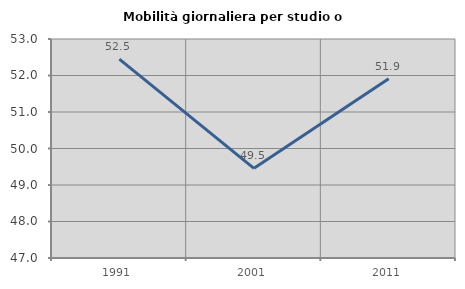
| Category | Mobilità giornaliera per studio o lavoro |
|---|---|
| 1991.0 | 52.451 |
| 2001.0 | 49.456 |
| 2011.0 | 51.91 |